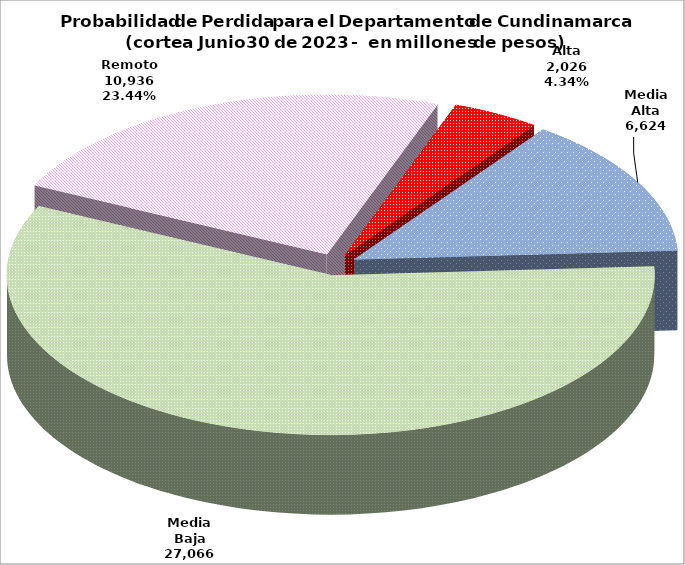
| Category | Series 0 |
|---|---|
| Alta | 2026.076 |
| Media Alta | 6623.806 |
| Media Baja | 27066.236 |
| Remoto | 10936.243 |